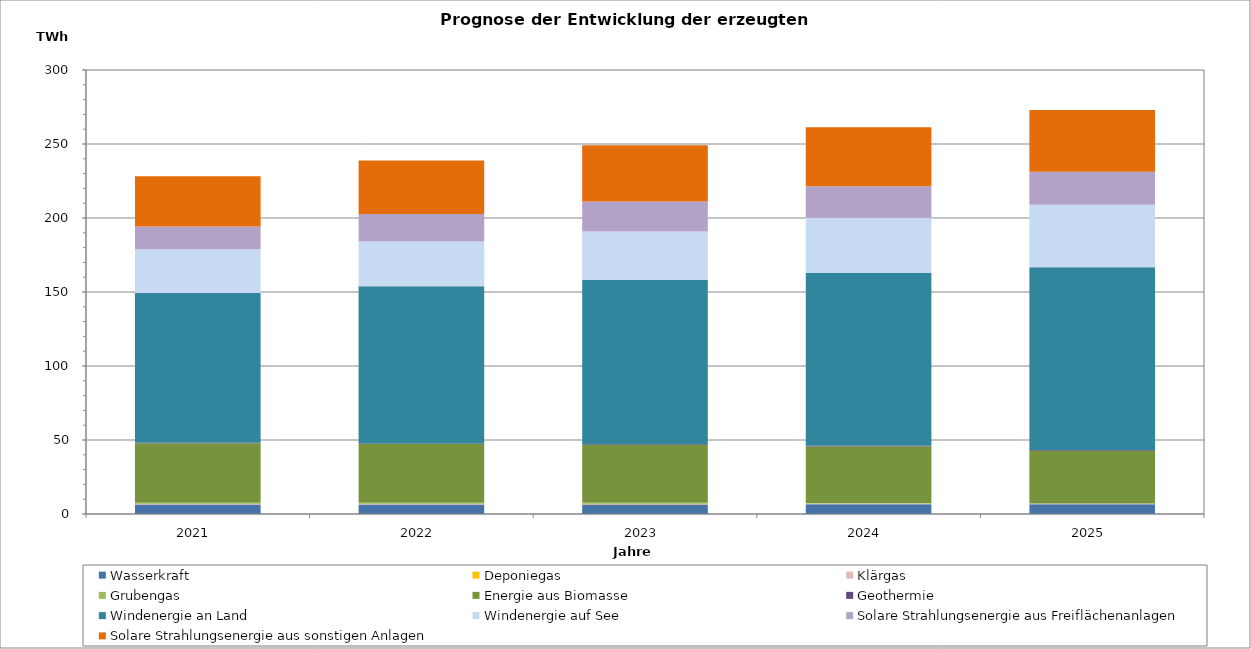
| Category | Wasserkraft | Deponiegas | Klärgas | Grubengas | Energie aus Biomasse | Geothermie | Windenergie an Land | Windenergie auf See | Solare Strahlungsenergie aus Freiflächenanlagen | Solare Strahlungsenergie aus sonstigen Anlagen |
|---|---|---|---|---|---|---|---|---|---|---|
| 2021.0 | 6378.431 | 101.745 | 428.609 | 720.425 | 40206.694 | 267.714 | 101185.74 | 29638.94 | 15380.48 | 33963.855 |
| 2022.0 | 6420.877 | 75.858 | 432.333 | 684.624 | 39669.386 | 347.049 | 106184.31 | 30246.585 | 18609.434 | 36098.322 |
| 2023.0 | 6463.508 | 68.083 | 436.059 | 628.631 | 39102.077 | 472.907 | 110945.4 | 32712.35 | 20344.573 | 38065.915 |
| 2024.0 | 6523.246 | 53.928 | 440.978 | 434.519 | 38121.908 | 541.965 | 116851.123 | 37229.342 | 21207.755 | 39991.134 |
| 2025.0 | 6548.405 | 32.897 | 443.51 | 40.192 | 35598.509 | 575.13 | 123404.438 | 42296.859 | 22239.132 | 41771.958 |